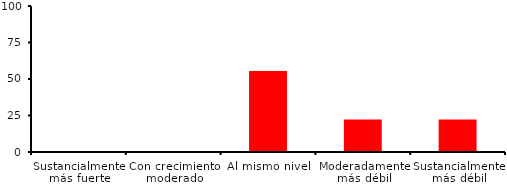
| Category | Series 0 |
|---|---|
| Sustancialmente más fuerte | 0 |
| Con crecimiento moderado | 0 |
| Al mismo nivel | 55.556 |
| Moderadamente más débil | 22.222 |
| Sustancialmente más débil | 22.222 |